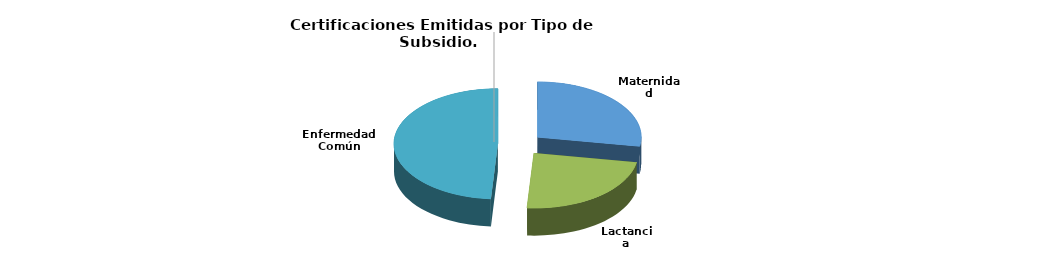
| Category | Total |
|---|---|
| Maternidad | 13 |
| Lactancia | 11 |
| Enfermedad Común | 23 |